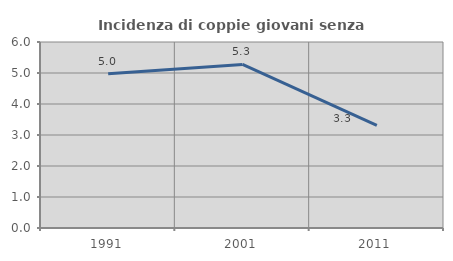
| Category | Incidenza di coppie giovani senza figli |
|---|---|
| 1991.0 | 4.974 |
| 2001.0 | 5.276 |
| 2011.0 | 3.311 |